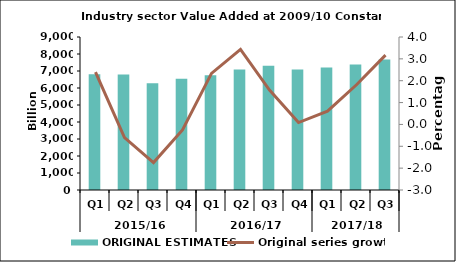
| Category | ORIGINAL ESTIMATES |
|---|---|
| 0 | 6815.098 |
| 1 | 6798.259 |
| 2 | 6286.623 |
| 3 | 6544.294 |
| 4 | 6756.027 |
| 5 | 7095.328 |
| 6 | 7303.567 |
| 7 | 7093.403 |
| 8 | 7199.003 |
| 9 | 7379.654 |
| 10 | 7670.121 |